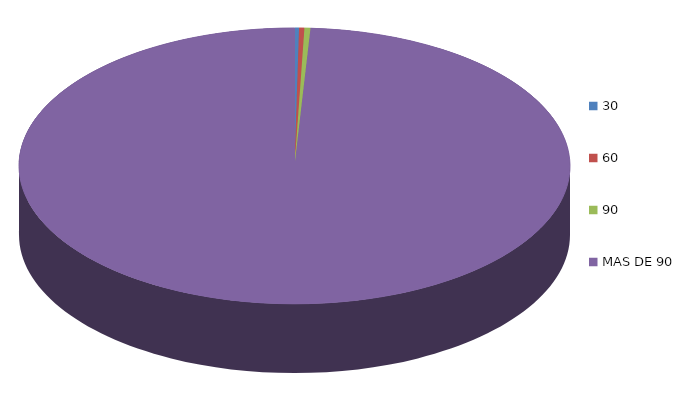
| Category | Series 0 | 107,346.8 |
|---|---|---|
| 0 | 107346.8 |  |
| 1 | 125421.7 |  |
| 2 | 143504.4 |  |
| 3 | 40162168.2 |  |